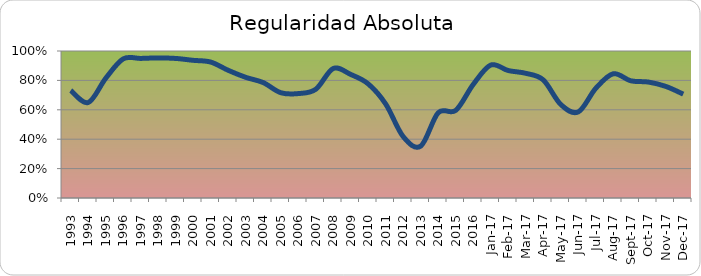
| Category | Series 0 |
|---|---|
| 1993.0 | 0.732 |
| 1994.0 | 0.65 |
| 1995.0 | 0.815 |
| 1996.0 | 0.947 |
| 1997.0 | 0.949 |
| 1998.0 | 0.953 |
| 1999.0 | 0.949 |
| 2000.0 | 0.936 |
| 2001.0 | 0.925 |
| 2002.0 | 0.868 |
| 2003.0 | 0.821 |
| 2004.0 | 0.785 |
| 2005.0 | 0.716 |
| 2006.0 | 0.71 |
| 2007.0 | 0.74 |
| 2008.0 | 0.881 |
| 2009.0 | 0.84 |
| 2010.0 | 0.776 |
| 2011.0 | 0.639 |
| 2012.0 | 0.417 |
| 2013.0 | 0.353 |
| 2014.0 | 0.58 |
| 2015.0 | 0.596 |
| 2016.0 | 0.773 |
| 42736.0 | 0.904 |
| 42767.0 | 0.867 |
| 42795.0 | 0.848 |
| 42826.0 | 0.803 |
| 42856.0 | 0.636 |
| 42887.0 | 0.585 |
| 42917.0 | 0.746 |
| 42948.0 | 0.845 |
| 42979.0 | 0.797 |
| 43009.0 | 0.789 |
| 43040.0 | 0.759 |
| 43070.0 | 0.707 |